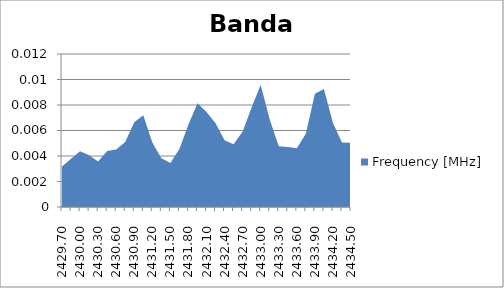
| Category | Frequency [MHz] |
|---|---|
| 2429.7 | 0.003 |
| 2429.85 | 0.004 |
| 2430.0 | 0.004 |
| 2430.15 | 0.004 |
| 2430.3 | 0.004 |
| 2430.45 | 0.004 |
| 2430.6 | 0.005 |
| 2430.75 | 0.005 |
| 2430.9 | 0.007 |
| 2431.05 | 0.007 |
| 2431.2 | 0.005 |
| 2431.35 | 0.004 |
| 2431.5 | 0.003 |
| 2431.65 | 0.005 |
| 2431.8 | 0.006 |
| 2431.95 | 0.008 |
| 2432.1 | 0.007 |
| 2432.25 | 0.007 |
| 2432.4 | 0.005 |
| 2432.55 | 0.005 |
| 2432.7 | 0.006 |
| 2432.85 | 0.008 |
| 2433.0 | 0.01 |
| 2433.15 | 0.007 |
| 2433.3 | 0.005 |
| 2433.45 | 0.005 |
| 2433.6 | 0.005 |
| 2433.75 | 0.006 |
| 2433.9 | 0.009 |
| 2434.05 | 0.009 |
| 2434.2 | 0.007 |
| 2434.35 | 0.005 |
| 2434.5 | 0.005 |